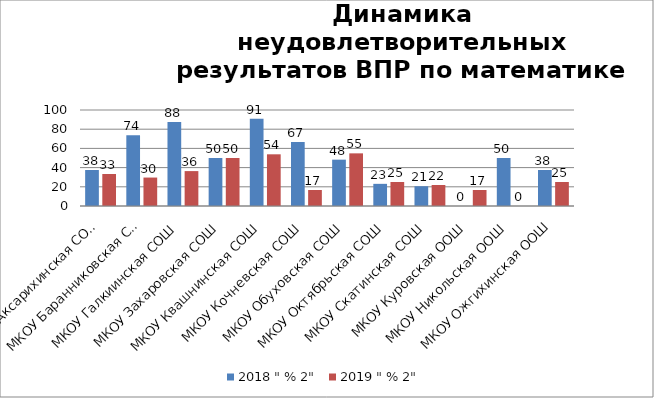
| Category | 2018 " % 2" | 2019 " % 2" |
|---|---|---|
| МКОУ Аксарихинская СОШ | 37.5 | 33.333 |
| МКОУ Баранниковская СОШ | 73.684 | 29.63 |
| МКОУ Галкиинская СОШ | 87.5 | 36.364 |
| МКОУ Захаровская СОШ | 50 | 50 |
| МКОУ Квашнинская СОШ | 90.909 | 53.846 |
| МКОУ Кочневская СОШ | 66.667 | 16.667 |
| МКОУ Обуховская СОШ | 48.276 | 54.839 |
| МКОУ Октябрьская СОШ | 23.077 | 25 |
| МКОУ Скатинская СОШ | 20.588 | 21.875 |
| МКОУ Куровская ООШ | 0 | 16.667 |
| МКОУ Никольская ООШ | 50 | 0 |
| МКОУ Ожгихинская ООШ | 37.5 | 25 |